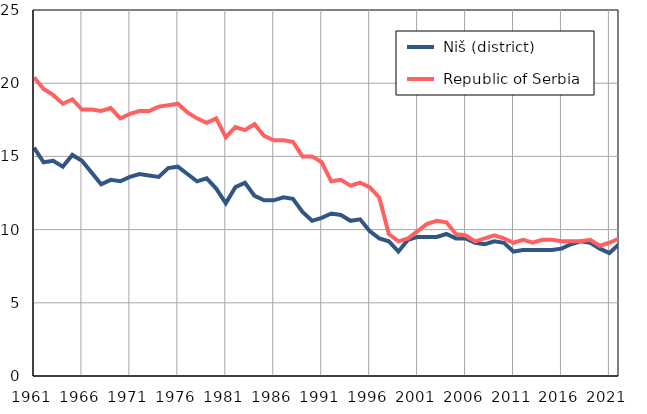
| Category |  Niš (district) |  Republic of Serbia |
|---|---|---|
| 1961.0 | 15.6 | 20.4 |
| 1962.0 | 14.6 | 19.6 |
| 1963.0 | 14.7 | 19.2 |
| 1964.0 | 14.3 | 18.6 |
| 1965.0 | 15.1 | 18.9 |
| 1966.0 | 14.7 | 18.2 |
| 1967.0 | 13.9 | 18.2 |
| 1968.0 | 13.1 | 18.1 |
| 1969.0 | 13.4 | 18.3 |
| 1970.0 | 13.3 | 17.6 |
| 1971.0 | 13.6 | 17.9 |
| 1972.0 | 13.8 | 18.1 |
| 1973.0 | 13.7 | 18.1 |
| 1974.0 | 13.6 | 18.4 |
| 1975.0 | 14.2 | 18.5 |
| 1976.0 | 14.3 | 18.6 |
| 1977.0 | 13.8 | 18 |
| 1978.0 | 13.3 | 17.6 |
| 1979.0 | 13.5 | 17.3 |
| 1980.0 | 12.8 | 17.6 |
| 1981.0 | 11.8 | 16.3 |
| 1982.0 | 12.9 | 17 |
| 1983.0 | 13.2 | 16.8 |
| 1984.0 | 12.3 | 17.2 |
| 1985.0 | 12 | 16.4 |
| 1986.0 | 12 | 16.1 |
| 1987.0 | 12.2 | 16.1 |
| 1988.0 | 12.1 | 16 |
| 1989.0 | 11.2 | 15 |
| 1990.0 | 10.6 | 15 |
| 1991.0 | 10.8 | 14.6 |
| 1992.0 | 11.1 | 13.3 |
| 1993.0 | 11 | 13.4 |
| 1994.0 | 10.6 | 13 |
| 1995.0 | 10.7 | 13.2 |
| 1996.0 | 9.9 | 12.9 |
| 1997.0 | 9.4 | 12.2 |
| 1998.0 | 9.2 | 9.7 |
| 1999.0 | 8.5 | 9.2 |
| 2000.0 | 9.3 | 9.4 |
| 2001.0 | 9.5 | 9.9 |
| 2002.0 | 9.5 | 10.4 |
| 2003.0 | 9.5 | 10.6 |
| 2004.0 | 9.7 | 10.5 |
| 2005.0 | 9.4 | 9.7 |
| 2006.0 | 9.4 | 9.6 |
| 2007.0 | 9.1 | 9.2 |
| 2008.0 | 9 | 9.4 |
| 2009.0 | 9.2 | 9.6 |
| 2010.0 | 9.1 | 9.4 |
| 2011.0 | 8.5 | 9.1 |
| 2012.0 | 8.6 | 9.3 |
| 2013.0 | 8.6 | 9.1 |
| 2014.0 | 8.6 | 9.3 |
| 2015.0 | 8.6 | 9.3 |
| 2016.0 | 8.7 | 9.2 |
| 2017.0 | 9 | 9.2 |
| 2018.0 | 9.2 | 9.2 |
| 2019.0 | 9.1 | 9.3 |
| 2020.0 | 8.7 | 8.9 |
| 2021.0 | 8.4 | 9.1 |
| 2022.0 | 9 | 9.4 |